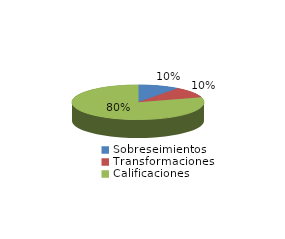
| Category | Series 0 |
|---|---|
| Sobreseimientos | 974 |
| Transformaciones | 981 |
| Calificaciones | 7654 |